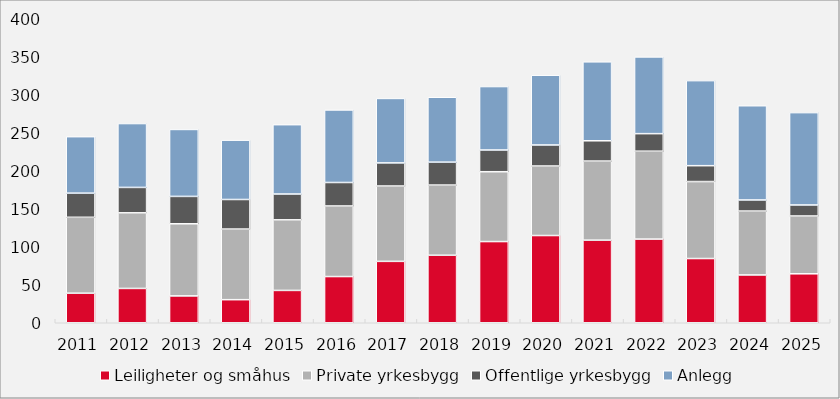
| Category | Leiligheter og småhus | Private yrkesbygg | Offentlige yrkesbygg | Anlegg |
|---|---|---|---|---|
| 2011.0 | 38.878 | 99.892 | 31.757 | 74.327 |
| 2012.0 | 45.158 | 99.478 | 33.441 | 84.046 |
| 2013.0 | 35.335 | 94.902 | 36.025 | 88.095 |
| 2014.0 | 30.359 | 92.921 | 38.903 | 78.077 |
| 2015.0 | 42.545 | 92.866 | 33.992 | 91.238 |
| 2016.0 | 60.811 | 92.83 | 30.909 | 95.462 |
| 2017.0 | 80.791 | 99.142 | 30.403 | 84.821 |
| 2018.0 | 88.839 | 92.344 | 30.128 | 85.41 |
| 2019.0 | 106.83 | 91.901 | 28.575 | 83.502 |
| 2020.0 | 114.78 | 91.459 | 27.681 | 91.794 |
| 2021.0 | 108.688 | 104.056 | 26.702 | 103.882 |
| 2022.0 | 110.1 | 115.64 | 23.081 | 100.955 |
| 2023.0 | 84.519 | 101.274 | 20.877 | 111.918 |
| 2024.0 | 62.923 | 84.036 | 14.614 | 123.988 |
| 2025.0 | 64.419 | 76.056 | 14.485 | 121.556 |